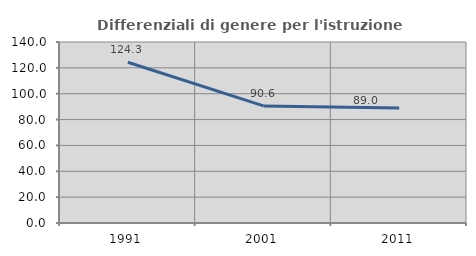
| Category | Differenziali di genere per l'istruzione superiore |
|---|---|
| 1991.0 | 124.298 |
| 2001.0 | 90.555 |
| 2011.0 | 89.041 |